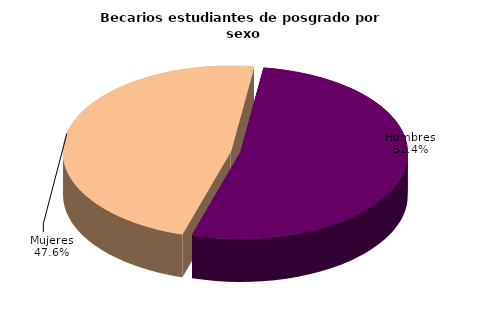
| Category | Series 0 |
|---|---|
| Hombres | 15771 |
| Mujeres | 14320 |